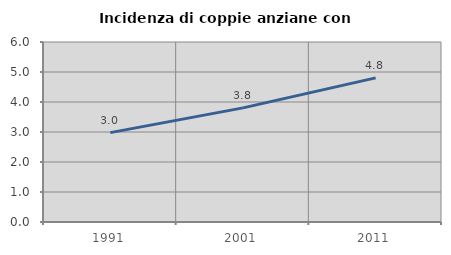
| Category | Incidenza di coppie anziane con figli |
|---|---|
| 1991.0 | 2.979 |
| 2001.0 | 3.804 |
| 2011.0 | 4.803 |